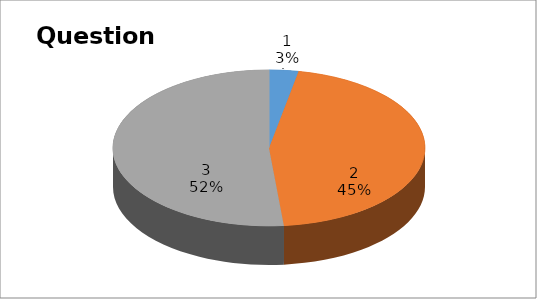
| Category | Series 0 |
|---|---|
| 0 | 1 |
| 1 | 15 |
| 2 | 17 |